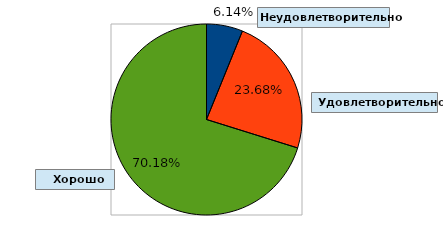
| Category | Series 0 |
|---|---|
| 0 | 0.061 |
| 1 | 0.237 |
| 2 | 0.702 |